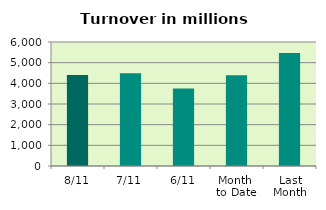
| Category | Series 0 |
|---|---|
| 8/11 | 4399.906 |
| 7/11 | 4482.882 |
| 6/11 | 3745.854 |
| Month 
to Date | 4388.927 |
| Last
Month | 5472.473 |